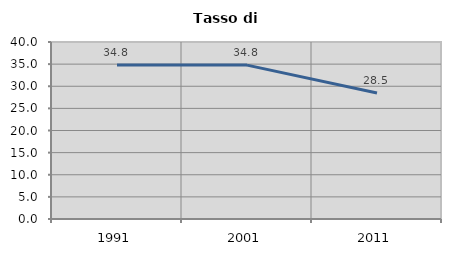
| Category | Tasso di disoccupazione   |
|---|---|
| 1991.0 | 34.803 |
| 2001.0 | 34.777 |
| 2011.0 | 28.455 |